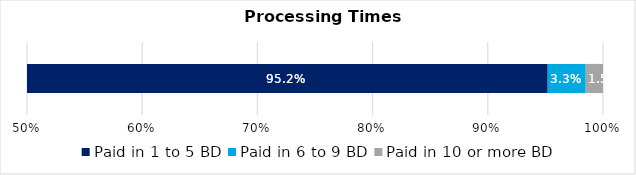
| Category | Paid in 1 to 5 BD | Paid in 6 to 9 BD | Paid in 10 or more BD |
|---|---|---|---|
| 0 | 0.952 | 0.033 | 0.015 |